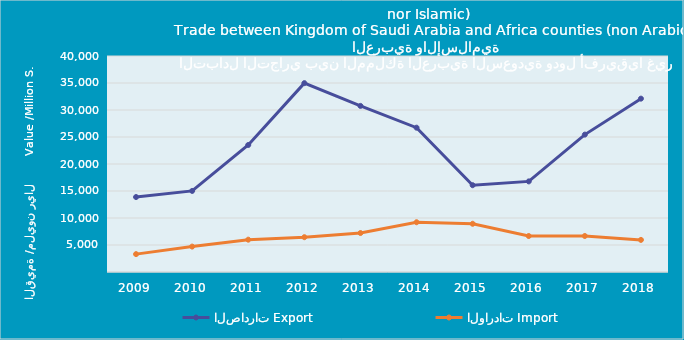
| Category | الصادرات | الواردات |
|---|---|---|
| 2009.0 | 13880800676 | 3311481165 |
| 2010.0 | 15013169940 | 4706256055 |
| 2011.0 | 23524019509 | 5985787992 |
| 2012.0 | 34973824101 | 6446689147 |
| 2013.0 | 30758464509 | 7215889024 |
| 2014.0 | 26725079028 | 9215043999 |
| 2015.0 | 16073042059 | 8929444542 |
| 2016.0 | 16777216326 | 6663097393 |
| 2017.0 | 25444314088 | 6667956926 |
| 2018.0 | 32102662185 | 5945455305 |